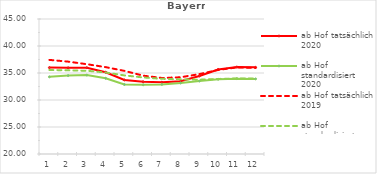
| Category | ab Hof tatsächlich 2020 | ab Hof standardisiert 2020 | ab Hof tatsächlich 2019 | ab Hof standardisiert 2019 |
|---|---|---|---|---|
| 0 | 36.001 | 34.283 | 37.427 | 35.562 |
| 1 | 35.96 | 34.517 | 37.107 | 35.494 |
| 2 | 35.979 | 34.613 | 36.63 | 35.416 |
| 3 | 35.139 | 34.019 | 36.085 | 35.093 |
| 4 | 33.715 | 32.874 | 35.398 | 34.557 |
| 5 | 33.387 | 32.812 | 34.509 | 34.178 |
| 6 | 33.292 | 32.889 | 34.082 | 33.923 |
| 7 | 33.483 | 33.135 | 34.209 | 33.823 |
| 8 | 34.45 | 33.501 | 34.795 | 33.758 |
| 9 | 35.646 | 33.835 | 35.566 | 33.9 |
| 10 | 36.105 | 33.955 | 36.029 | 33.993 |
| 11 | 36.045 | 33.91 | 35.946 | 33.986 |